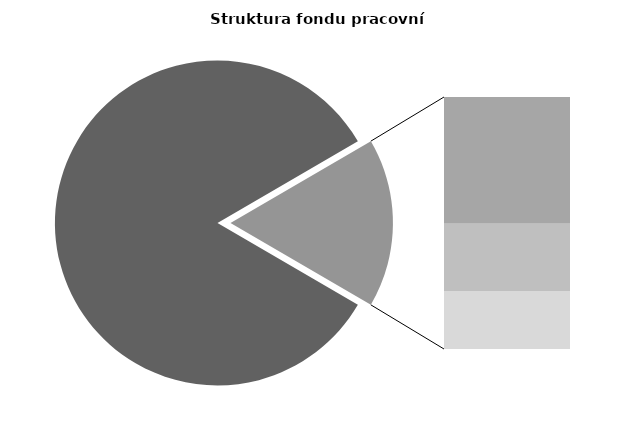
| Category | Series 0 |
|---|---|
| Průměrná měsíční odpracovaná doba bez přesčasu | 140.501 |
| Dovolená | 14.288 |
| Nemoc | 7.571 |
| Jiné | 6.526 |